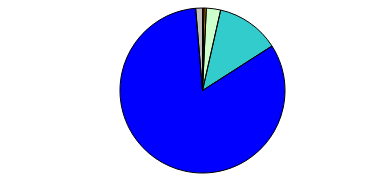
| Category | Series 0 |
|---|---|
| 0 | 2 |
| 1 | 3 |
| 2 | 19 |
| 3 | 84 |
| 4 | 561 |
| 5 | 9 |